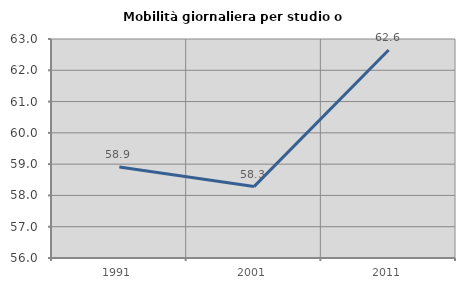
| Category | Mobilità giornaliera per studio o lavoro |
|---|---|
| 1991.0 | 58.909 |
| 2001.0 | 58.282 |
| 2011.0 | 62.649 |